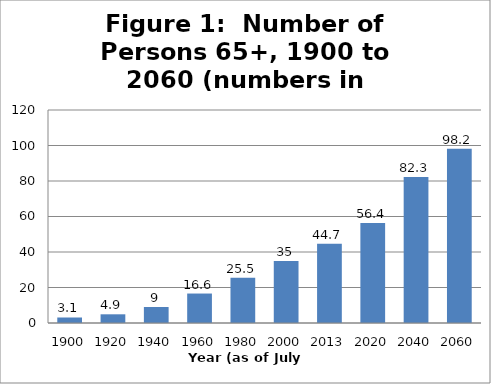
| Category | Series 0 |
|---|---|
| 1900.0 | 3.1 |
| 1920.0 | 4.9 |
| 1940.0 | 9 |
| 1960.0 | 16.6 |
| 1980.0 | 25.5 |
| 2000.0 | 35 |
| 2013.0 | 44.7 |
| 2020.0 | 56.4 |
| 2040.0 | 82.3 |
| 2060.0 | 98.2 |